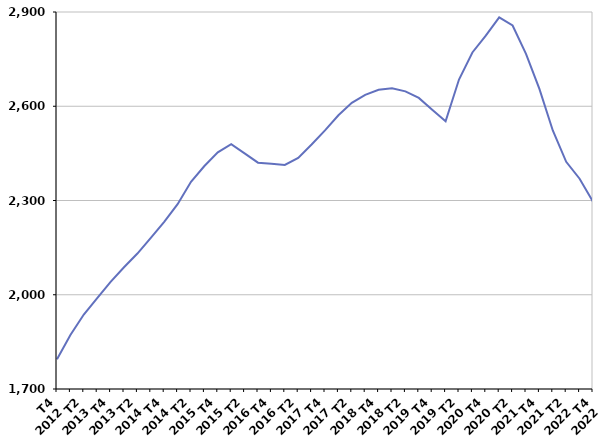
| Category | Inscrits depuis plus d'un an |
|---|---|
| T4
2012 | 1794.9 |
| T1
2013 | 1871.8 |
| T2
2013 | 1937.1 |
| T3
2013 | 1989.1 |
| T4
2013 | 2041.1 |
| T1
2014 | 2087.5 |
| T2
2014 | 2131.2 |
| T3
2014 | 2181 |
| T4
2014 | 2232.3 |
| T1
2015 | 2288.3 |
| T2
2015 | 2359.7 |
| T3
2015 | 2409.8 |
| T4
2015 | 2453.2 |
| T1
2016 | 2479.2 |
| T2
2016 | 2450 |
| T3
2016 | 2420.4 |
| T4
2016 | 2417.3 |
| T1
2017 | 2413.2 |
| T2
2017 | 2435.8 |
| T3
2017 | 2478.4 |
| T4
2017 | 2523.2 |
| T1
2018 | 2571.4 |
| T2
2018 | 2611 |
| T3
2018 | 2636.4 |
| T4
2018 | 2652.4 |
| T1
2019 | 2657.1 |
| T2
2019 | 2647.3 |
| T3
2019 | 2626.6 |
| T4
2019 | 2588.6 |
| T1
2020 | 2551.9 |
| T2
2020 | 2685 |
| T3
2020 | 2771.2 |
| T4
2020 | 2824.7 |
| T1
2021 | 2883 |
| T2
2021 | 2857.1 |
| T3
2021 | 2766.6 |
| T4
2021 | 2655.4 |
| T1
2022 | 2522.9 |
| T2
2022 | 2423.2 |
| T3
2022 | 2369.3 |
| T4
2022 | 2295.9 |